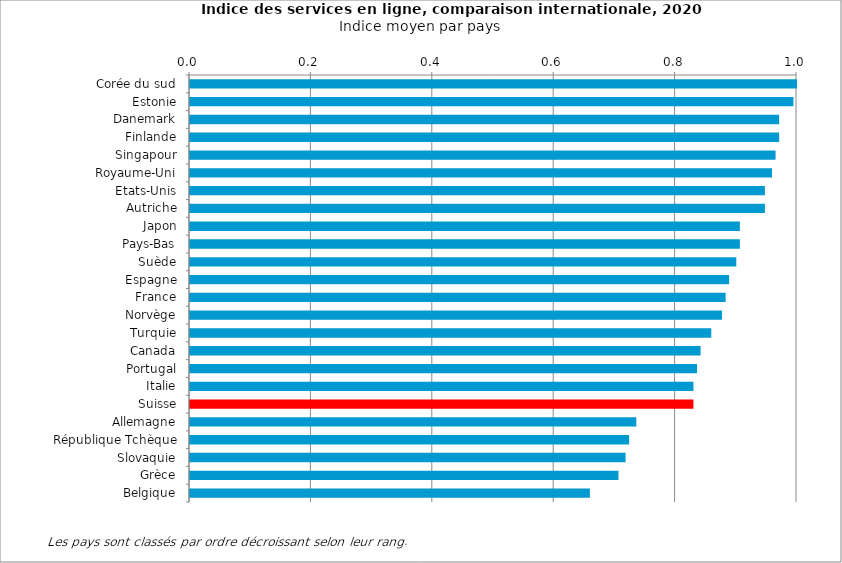
| Category | Indice moyen |
|---|---|
| Corée du sud | 1 |
| Estonie | 0.994 |
| Danemark | 0.971 |
| Finlande | 0.971 |
| Singapour | 0.965 |
| Royaume-Uni | 0.959 |
| Etats-Unis | 0.947 |
| Autriche | 0.947 |
| Japon | 0.906 |
| Pays-Bas | 0.906 |
| Suède | 0.9 |
| Espagne | 0.888 |
| France | 0.882 |
| Norvège | 0.876 |
| Turquie | 0.859 |
| Canada | 0.841 |
| Portugal | 0.835 |
| Italie | 0.829 |
| Suisse | 0.829 |
| Allemagne | 0.735 |
| République Tchèque | 0.724 |
| Slovaquie | 0.718 |
| Grèce | 0.706 |
| Belgique | 0.659 |